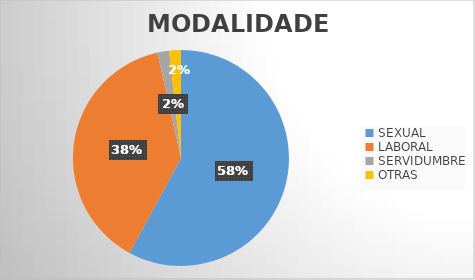
| Category | Series 0 |
|---|---|
| SEXUAL | 33 |
| LABORAL | 22 |
| SERVIDUMBRE | 1 |
| OTRAS | 1 |